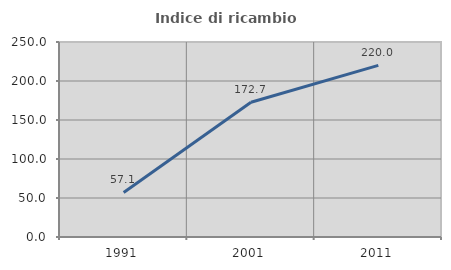
| Category | Indice di ricambio occupazionale  |
|---|---|
| 1991.0 | 57.143 |
| 2001.0 | 172.727 |
| 2011.0 | 220 |